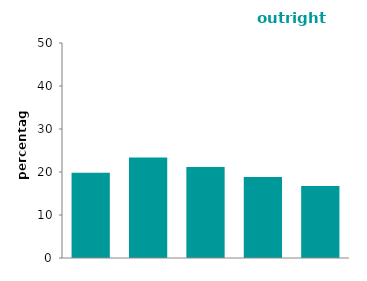
| Category | outright owners |
|---|---|
| 1st    quintile (lowest incomes) | 19.85 |
| 2nd    quintile | 23.351 |
| 3rd    quintile | 21.181 |
| 4th    quintile | 18.865 |
| 5th     quintile (highest incomes) | 16.752 |